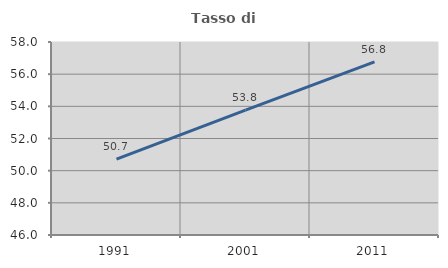
| Category | Tasso di occupazione   |
|---|---|
| 1991.0 | 50.72 |
| 2001.0 | 53.767 |
| 2011.0 | 56.765 |